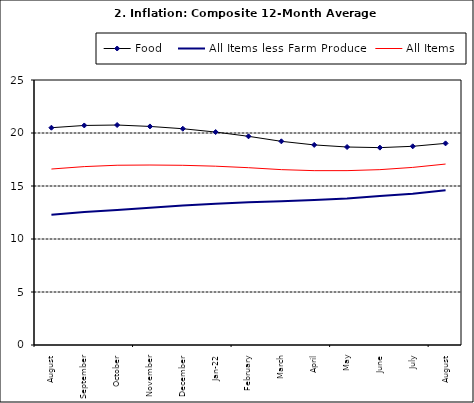
| Category | Food | All Items less Farm Produce | All Items |
|---|---|---|---|
| August | 20.499 | 12.291 | 16.601 |
| September | 20.711 | 12.553 | 16.83 |
| October | 20.753 | 12.725 | 16.958 |
| November | 20.619 | 12.956 | 16.979 |
| December | 20.403 | 13.161 | 16.953 |
| Jan-22 | 20.089 | 13.326 | 16.869 |
| February | 19.687 | 13.461 | 16.728 |
| March | 19.214 | 13.562 | 16.544 |
| April | 18.876 | 13.681 | 16.449 |
| May | 18.679 | 13.83 | 16.449 |
| June | 18.619 | 14.057 | 16.542 |
| July | 18.745 | 14.278 | 16.755 |
| August | 19.021 | 14.603 | 17.07 |